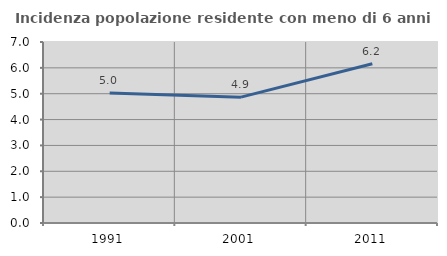
| Category | Incidenza popolazione residente con meno di 6 anni |
|---|---|
| 1991.0 | 5.03 |
| 2001.0 | 4.868 |
| 2011.0 | 6.157 |